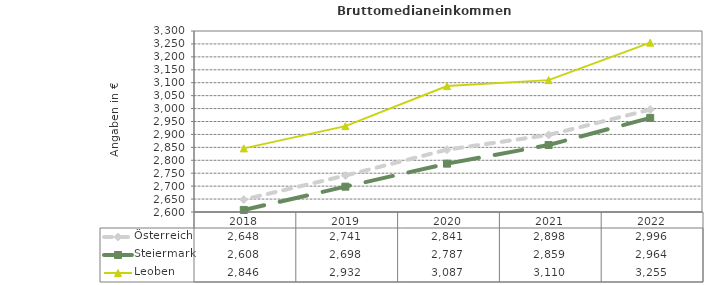
| Category | Österreich | Steiermark | Leoben |
|---|---|---|---|
| 2022.0 | 2996 | 2964 | 3255 |
| 2021.0 | 2898 | 2859 | 3110 |
| 2020.0 | 2841 | 2787 | 3087 |
| 2019.0 | 2741 | 2698 | 2932 |
| 2018.0 | 2648 | 2608 | 2846 |